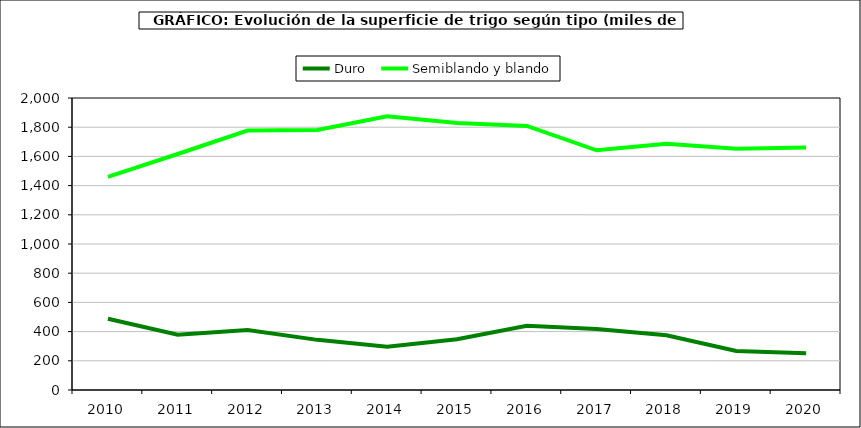
| Category | Duro | Semiblando y blando |
|---|---|---|
| 2010 | 488.306 | 1459.767 |
| 2011 | 378.054 | 1616.599 |
| 2012 | 411.053 | 1777.118 |
| 2013 | 343.389 | 1781.58 |
| 2014 | 297.13 | 1874.542 |
| 2015 | 347.93 | 1828.423 |
| 2016 | 440.16 | 1808.688 |
| 2017 | 417.589 | 1641.635 |
| 2018 | 374.608 | 1686.9 |
| 2019 | 266.644 | 1651.762 |
| 2020 | 250.903 | 1661.696 |